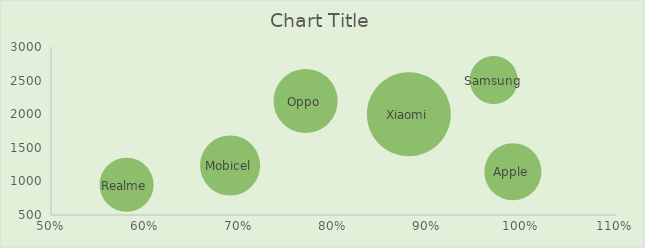
| Category | Series 0 |
|---|---|
| 0.97 | 2511 |
| 0.77 | 2201 |
| 0.88 | 2000 |
| 0.69 | 1240 |
| 0.99 | 1150 |
| 0.58 | 952 |